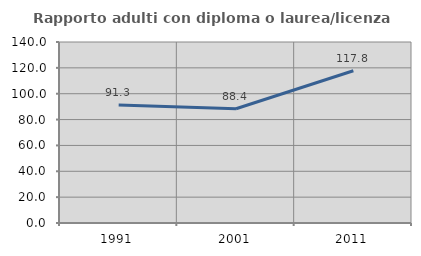
| Category | Rapporto adulti con diploma o laurea/licenza media  |
|---|---|
| 1991.0 | 91.327 |
| 2001.0 | 88.401 |
| 2011.0 | 117.757 |